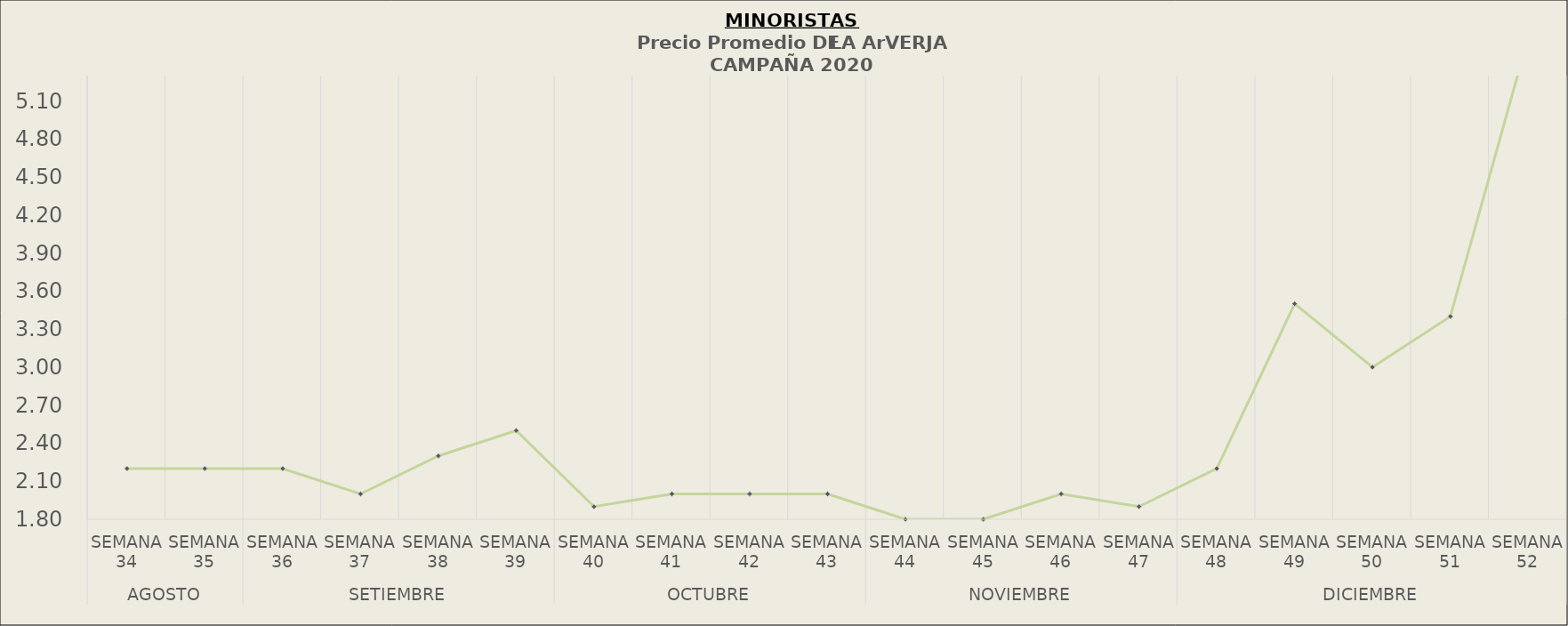
| Category | Precio Promedio ( S/.x Kg.) |
|---|---|
| 0 | 2.2 |
| 1 | 2.2 |
| 2 | 2.2 |
| 3 | 2 |
| 4 | 2.3 |
| 5 | 2.5 |
| 6 | 1.9 |
| 7 | 2 |
| 8 | 2 |
| 9 | 2 |
| 10 | 1.8 |
| 11 | 1.8 |
| 12 | 2 |
| 13 | 1.9 |
| 14 | 2.2 |
| 15 | 3.5 |
| 16 | 3 |
| 17 | 3.4 |
| 18 | 5.6 |